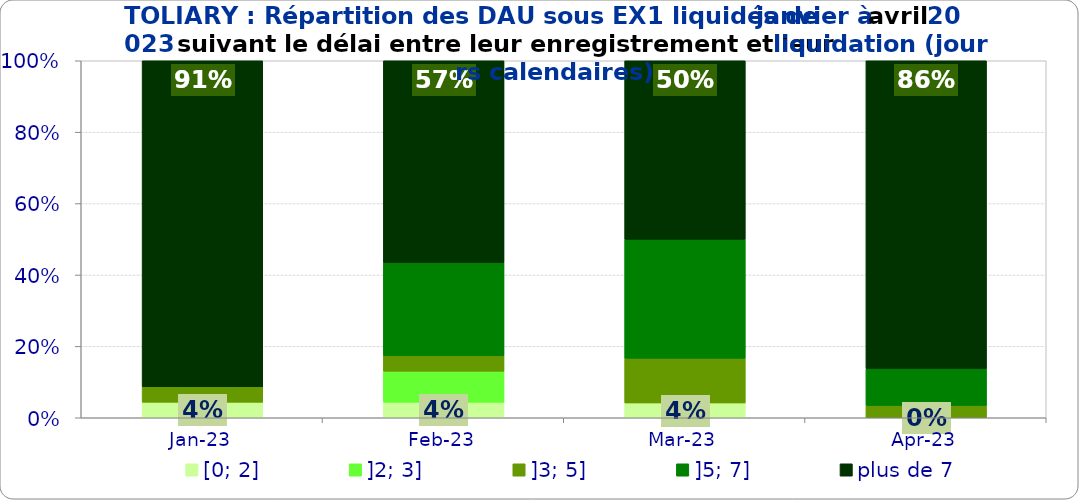
| Category | [0; 2] | ]2; 3] | ]3; 5] | ]5; 7] | plus de 7 |
|---|---|---|---|---|---|
| 2023-01-01 | 0.043 | 0 | 0.043 | 0 | 0.913 |
| 2023-02-01 | 0.043 | 0.087 | 0.043 | 0.261 | 0.565 |
| 2023-03-01 | 0.042 | 0 | 0.125 | 0.333 | 0.5 |
| 2023-04-01 | 0 | 0 | 0.034 | 0.103 | 0.862 |